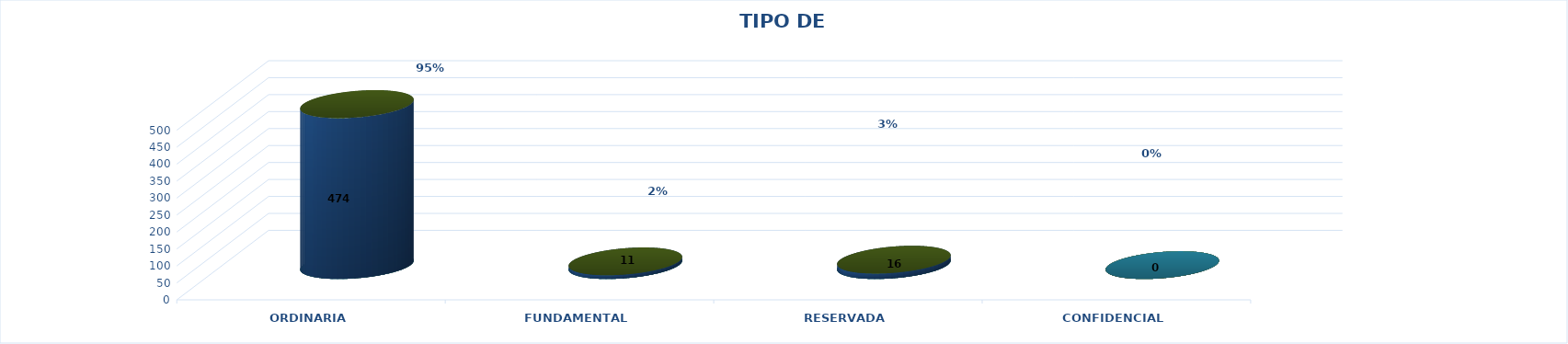
| Category | Series 0 | Series 2 | Series 1 | Series 3 | Series 4 |
|---|---|---|---|---|---|
| ORDINARIA |  |  |  | 474 | 0.946 |
| FUNDAMENTAL |  |  |  | 11 | 0.022 |
| RESERVADA |  |  |  | 16 | 0.032 |
| CONFIDENCIAL |  |  |  | 0 | 0 |